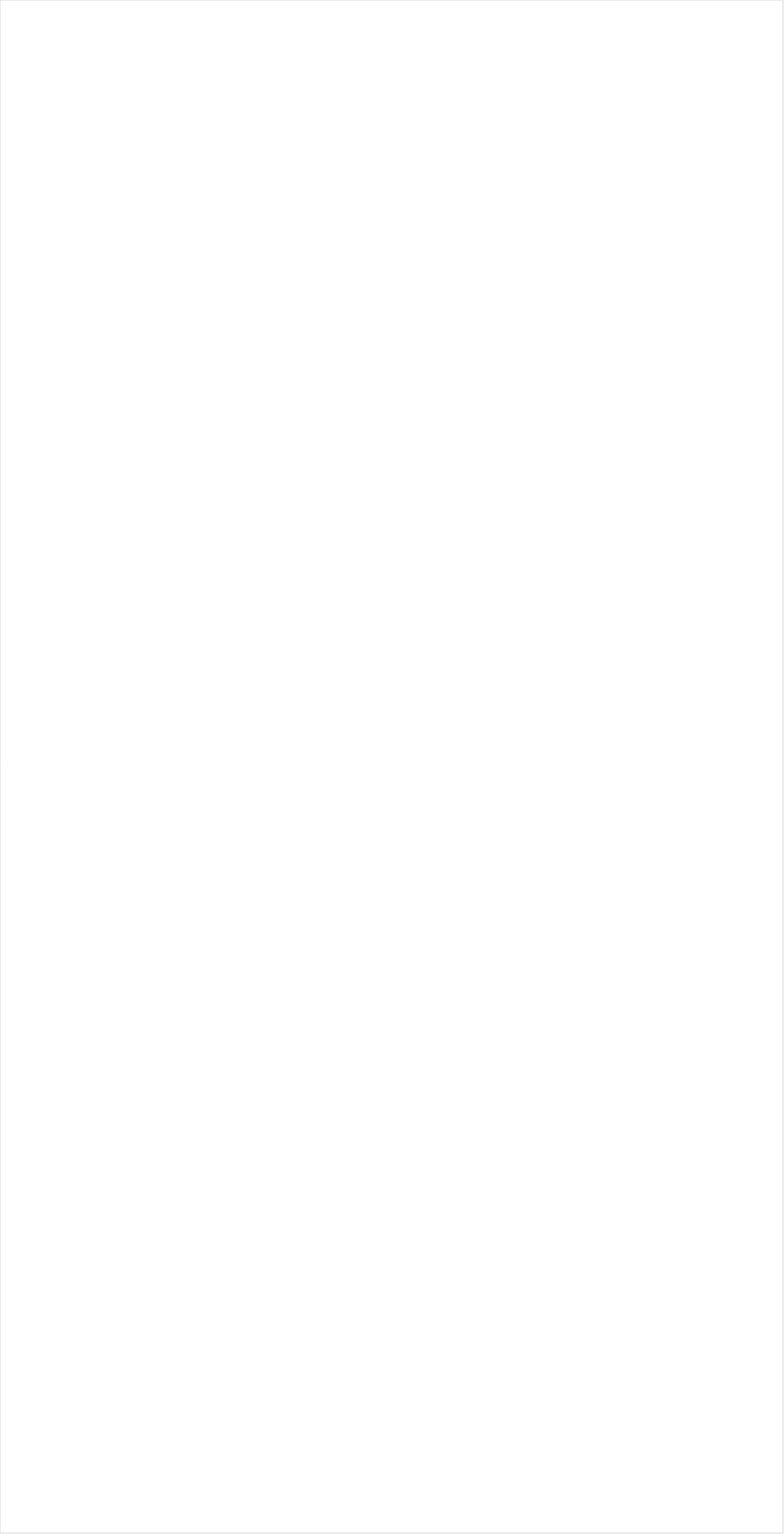
| Category | Total |
|---|---|
| Galavision | -0.938 |
| TUDN | -0.927 |
| Telemundo | -0.895 |
| ESPN Deportes | -0.886 |
| UniMas | -0.877 |
| Univision | -0.832 |
| NBC Universo | -0.806 |
| BET Her | -0.793 |
| MTV2 | -0.673 |
| BET | -0.661 |
| TV ONE | -0.615 |
| Nick Toons | -0.585 |
| Cartoon Network | -0.567 |
| VH1 | -0.548 |
| NBA TV | -0.534 |
| Teen Nick | -0.532 |
| Disney Channel | -0.467 |
| Nick Jr. | -0.442 |
| Lifetime | -0.404 |
| Disney XD | -0.374 |
| Tennis Channel | -0.365 |
| Adult Swim | -0.361 |
| Lifetime Movies | -0.356 |
| Oprah Winfrey Network | -0.349 |
| MSNBC | -0.346 |
| Disney Junior US | -0.32 |
| Nick | -0.312 |
| Nick@Nite | -0.308 |
| BRAVO | -0.307 |
| CNN | -0.273 |
| Universal Kids | -0.228 |
| TLC | -0.19 |
| E! | -0.184 |
| Discovery Life Channel | -0.178 |
| WE TV | -0.125 |
| Logo | -0.125 |
| MTV | -0.108 |
| Freeform | -0.107 |
| Comedy Central | -0.063 |
| FX | -0.061 |
| CNBC | -0.011 |
| Hallmark Movies & Mysteries | 0.011 |
| HGTV | 0.013 |
| Hallmark | 0.029 |
| Investigation Discovery | 0.031 |
| Discovery Family Channel | 0.031 |
| TNT | 0.033 |
| ESPN | 0.039 |
| SYFY | 0.047 |
| truTV | 0.048 |
| OXYGEN | 0.055 |
| Ovation | 0.059 |
| Paramount Network | 0.081 |
| CW | 0.083 |
| ION | 0.088 |
| FXX | 0.089 |
| TBS | 0.089 |
| PBS | 0.098 |
| POP | 0.111 |
| Olympic Channel | 0.116 |
| Game Show | 0.118 |
| Golf | 0.121 |
| SundanceTV | 0.121 |
| Headline News | 0.124 |
| AMC | 0.142 |
| USA Network | 0.145 |
| ABC | 0.16 |
| Travel | 0.16 |
| Food Network | 0.163 |
| UP TV | 0.169 |
| BBC America | 0.171 |
| PAC-12 Network | 0.195 |
| Bloomberg HD | 0.207 |
| FX Movie Channel | 0.216 |
| MyNetworkTV | 0.244 |
| NBC | 0.25 |
| Reelz Channel | 0.278 |
| NFL Network | 0.288 |
| TV LAND | 0.291 |
| Viceland | 0.293 |
| ESPN2 | 0.299 |
| Fox Business | 0.313 |
| Cooking Channel | 0.363 |
| Independent Film (IFC) | 0.385 |
| Big Ten Network | 0.403 |
| CBS | 0.403 |
| FOX | 0.457 |
| ESPNU | 0.487 |
| Fox News | 0.49 |
| Destination America | 0.51 |
| Great American Country | 0.531 |
| WGN America | 0.567 |
| CMTV | 0.57 |
| INSP | 0.571 |
| A&E | 0.581 |
| National Geographic Wild | 0.598 |
| Animal Planet | 0.606 |
| ESPNEWS | 0.606 |
| DIY | 0.61 |
| Smithsonian | 0.659 |
| FXDEP | 0.664 |
| American Heroes Channel | 0.665 |
| MLB Network | 0.699 |
| NHL | 0.721 |
| History Channel | 0.738 |
| Science Channel | 0.793 |
| National Geographic | 0.82 |
| Discovery Channel | 1.033 |
| FYI | 1.064 |
| The Sportsman Channel | 1.09 |
| Weather Channel | 1.362 |
| CBS Sports | 1.425 |
| Outdoor Channel | 1.586 |
| RFD TV | 1.633 |
| Motor Trend Network | 1.645 |
| Fox Sports 1 | 2.863 |
| NBC Sports | 7.632 |